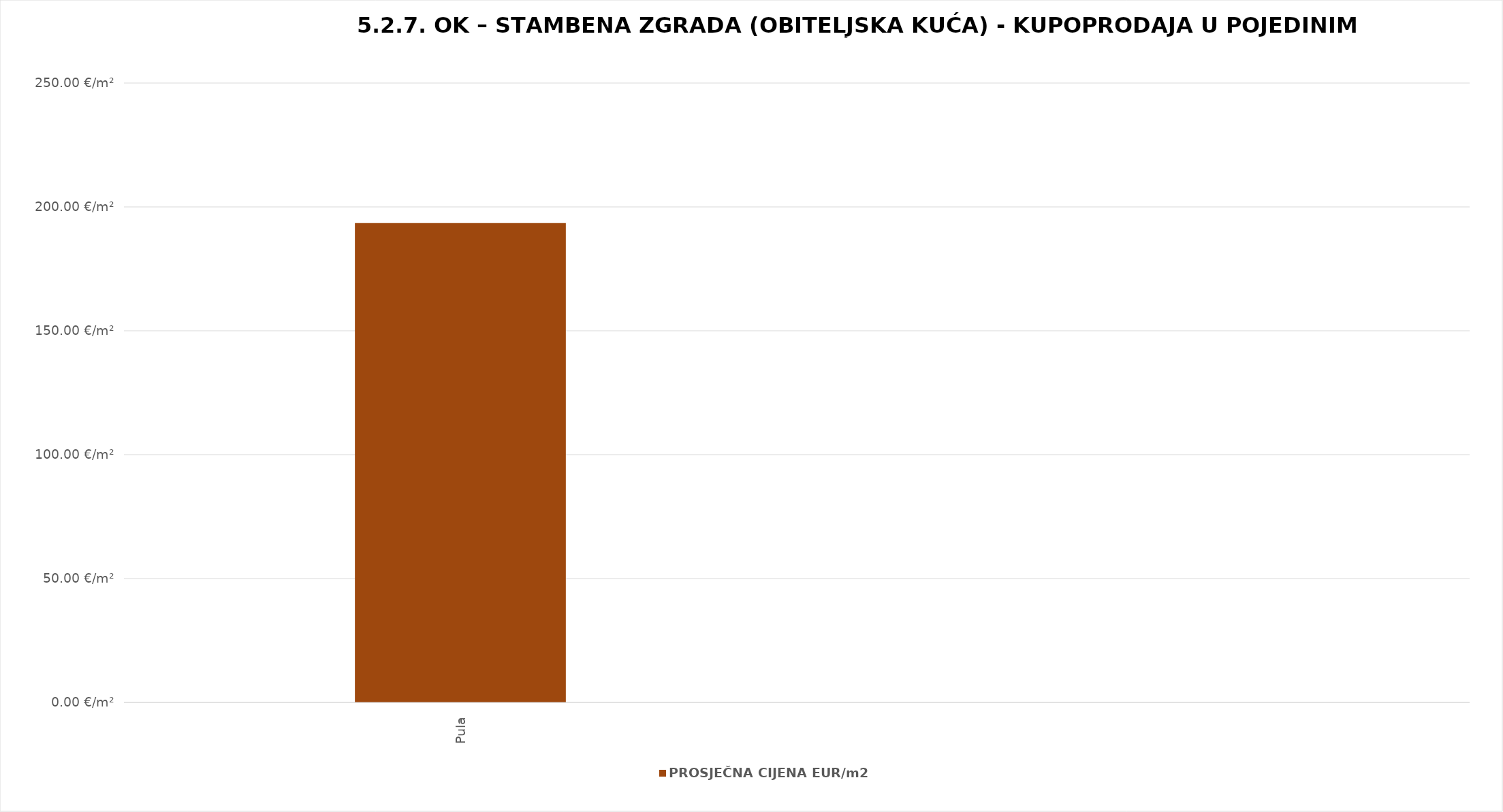
| Category | PROSJEČNA CIJENA EUR/m2 |
|---|---|
| Pula | 1900-07-11 10:50:00 |